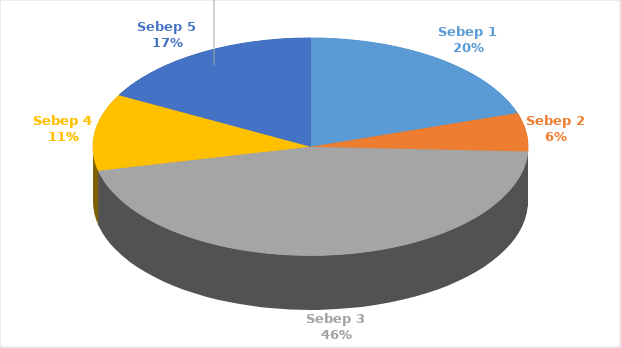
| Category | Series 0 |
|---|---|
| Sebep 1 | 7 |
| Sebep 2 | 2 |
| Sebep 3 | 16 |
| Sebep 4 | 4 |
| Sebep 5 | 6 |